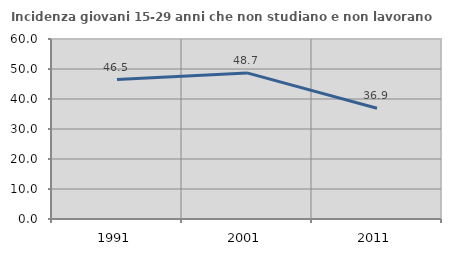
| Category | Incidenza giovani 15-29 anni che non studiano e non lavorano  |
|---|---|
| 1991.0 | 46.471 |
| 2001.0 | 48.7 |
| 2011.0 | 36.905 |